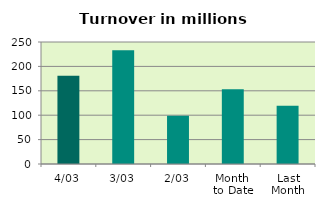
| Category | Series 0 |
|---|---|
| 4/03 | 180.986 |
| 3/03 | 233.323 |
| 2/03 | 99.003 |
| Month 
to Date | 152.934 |
| Last
Month | 119.242 |